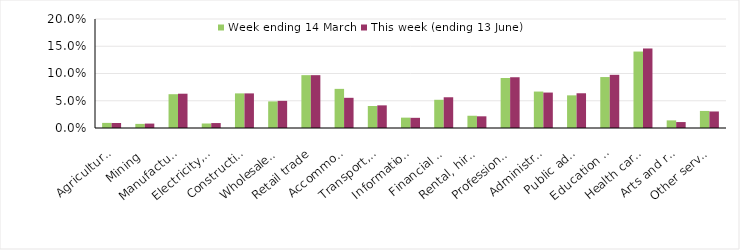
| Category | Week ending 14 March | This week (ending 13 June) |
|---|---|---|
| Agriculture, forestry and fishing | 0.009 | 0.009 |
| Mining | 0.008 | 0.008 |
| Manufacturing | 0.062 | 0.063 |
| Electricity, gas, water and waste services | 0.008 | 0.009 |
| Construction | 0.064 | 0.064 |
| Wholesale trade | 0.049 | 0.05 |
| Retail trade | 0.097 | 0.097 |
| Accommodation and food services | 0.072 | 0.055 |
| Transport, postal and warehousing | 0.04 | 0.042 |
| Information media and telecommunications | 0.019 | 0.019 |
| Financial and insurance services | 0.052 | 0.056 |
| Rental, hiring and real estate services | 0.022 | 0.021 |
| Professional, scientific and technical services | 0.092 | 0.093 |
| Administrative and support services | 0.067 | 0.065 |
| Public administration and safety | 0.06 | 0.064 |
| Education and training | 0.094 | 0.098 |
| Health care and social assistance | 0.14 | 0.146 |
| Arts and recreation services | 0.014 | 0.011 |
| Other services | 0.031 | 0.03 |